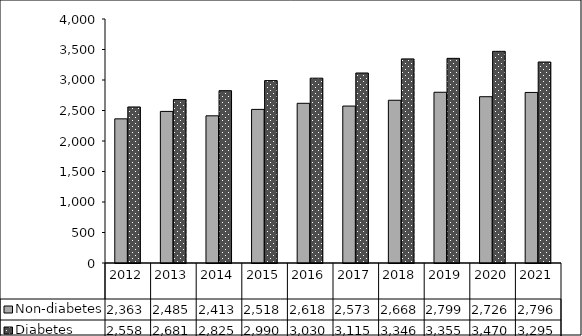
| Category | Non-diabetes | Diabetes |
|---|---|---|
| 2012 | 2363 | 2558 |
| 2013 | 2485 | 2681 |
| 2014 | 2413 | 2825 |
| 2015 | 2518 | 2990 |
| 2016 | 2618 | 3030 |
| 2017 | 2573 | 3115 |
| 2018 | 2668 | 3346 |
| 2019 | 2799 | 3355 |
| 2020 | 2726 | 3470 |
| 2021 | 2796 | 3295 |